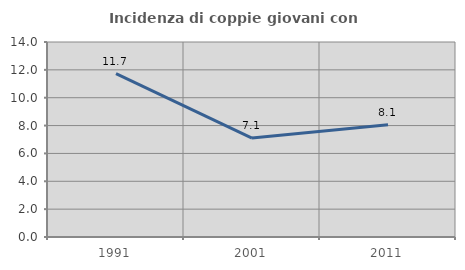
| Category | Incidenza di coppie giovani con figli |
|---|---|
| 1991.0 | 11.728 |
| 2001.0 | 7.101 |
| 2011.0 | 8.054 |